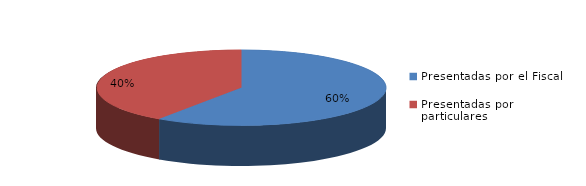
| Category | Series 0 |
|---|---|
| Presentadas por el Fiscal | 147 |
| Presentadas por particulares | 100 |